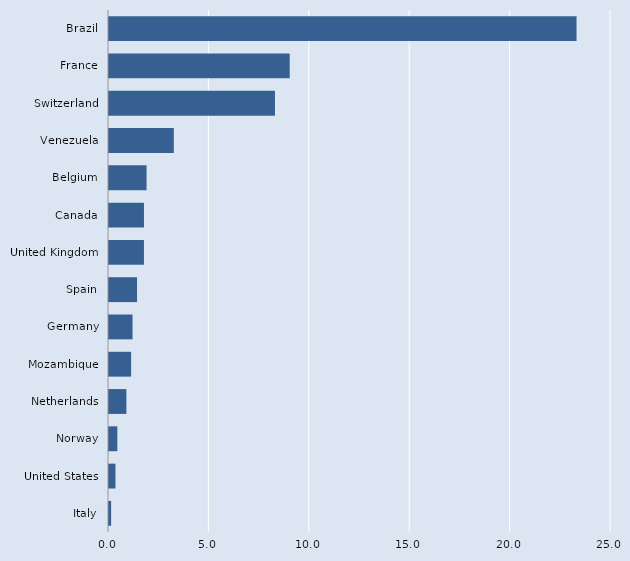
| Category | Series 0 |
|---|---|
| Italy | 0.106 |
| United States | 0.322 |
| Norway | 0.415 |
| Netherlands | 0.866 |
| Mozambique | 1.101 |
| Germany | 1.173 |
| Spain | 1.397 |
| United Kingdom | 1.74 |
| Canada | 1.742 |
| Belgium | 1.871 |
| Venezuela | 3.227 |
| Switzerland | 8.266 |
| France | 8.999 |
| Brazil | 23.284 |